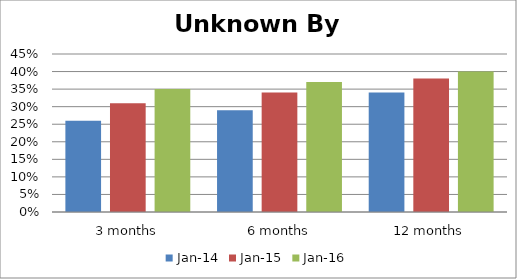
| Category | Jan-14 | Jan-15 | Jan-16 |
|---|---|---|---|
| 3 months | 0.26 | 0.31 | 0.35 |
| 6 months | 0.29 | 0.34 | 0.37 |
| 12 months | 0.34 | 0.38 | 0.4 |